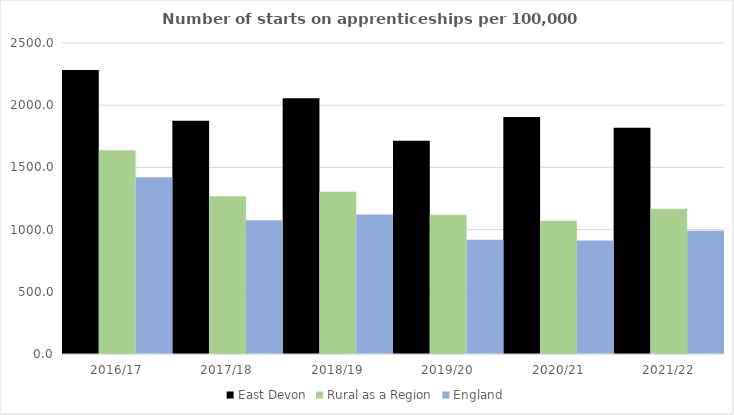
| Category | East Devon | Rural as a Region | England |
|---|---|---|---|
| 2016/17 | 2282 | 1638.789 | 1420 |
| 2017/18 | 1874 | 1267.474 | 1075 |
| 2018/19 | 2055 | 1304.57 | 1122 |
| 2019/20 | 1715 | 1119.662 | 918 |
| 2020/21 | 1906 | 1070.748 | 912 |
| 2021/22 | 1818 | 1167.68 | 991 |